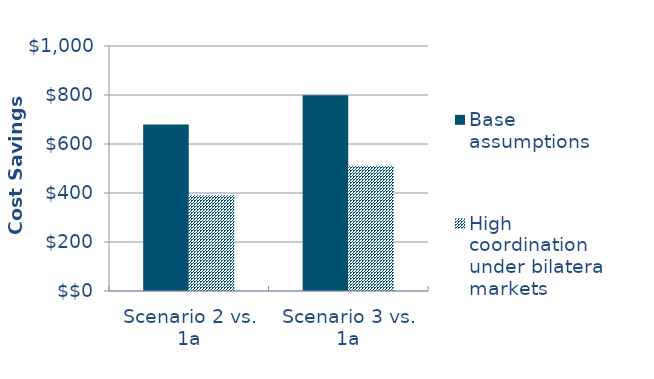
| Category | Base assumptions  | High coordination under bilateral markets |
|---|---|---|
| Scenario 2 vs. 1a | -679.806 | -391.282 |
| Scenario 3 vs. 1a | -799.049 | -510.525 |